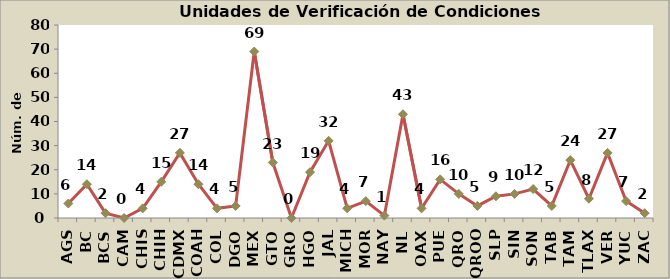
| Category | Total |
|---|---|
| AGS | 6 |
| BC | 14 |
| BCS | 2 |
| CAM | 0 |
| CHIS | 4 |
| CHIH | 15 |
| CDMX | 27 |
| COAH | 14 |
| COL | 4 |
| DGO | 5 |
| MEX | 69 |
| GTO | 23 |
| GRO | 0 |
| HGO | 19 |
| JAL | 32 |
| MICH | 4 |
| MOR | 7 |
| NAY | 1 |
| NL | 43 |
| OAX | 4 |
| PUE | 16 |
| QRO | 10 |
| QROO | 5 |
| SLP | 9 |
| SIN | 10 |
| SON | 12 |
| TAB | 5 |
| TAM | 24 |
| TLAX | 8 |
| VER | 27 |
| YUC | 7 |
| ZAC | 2 |